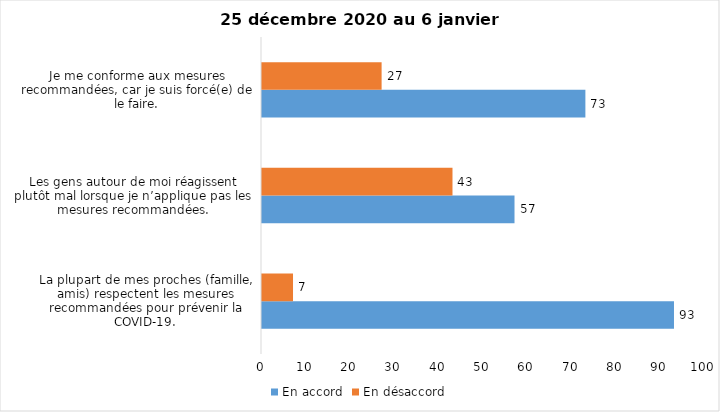
| Category | En accord | En désaccord |
|---|---|---|
| La plupart de mes proches (famille, amis) respectent les mesures recommandées pour prévenir la COVID-19. | 93 | 7 |
| Les gens autour de moi réagissent plutôt mal lorsque je n’applique pas les mesures recommandées. | 57 | 43 |
| Je me conforme aux mesures recommandées, car je suis forcé(e) de le faire. | 73 | 27 |